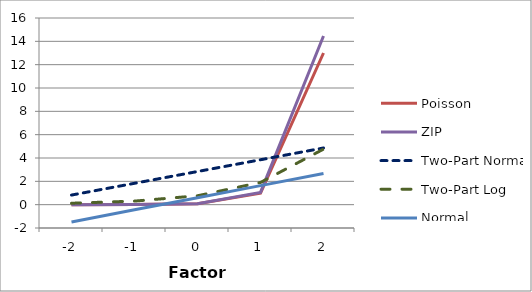
| Category | Poisson | ZIP | Two-Part Normal | Two-Part Log | Normal |
|---|---|---|---|---|---|
| -2.0 | 0 | 0 | 0.823 | 0.122 | -1.481 |
| -1.0 | 0.006 | 0.006 | 1.832 | 0.305 | -0.444 |
| 0.0 | 0.075 | 0.077 | 2.841 | 0.762 | 0.593 |
| 1.0 | 0.987 | 1.054 | 3.85 | 1.904 | 1.63 |
| 2.0 | 13.001 | 14.454 | 4.859 | 4.759 | 2.667 |